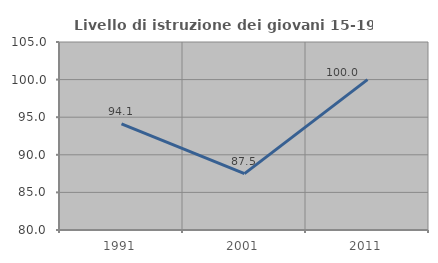
| Category | Livello di istruzione dei giovani 15-19 anni |
|---|---|
| 1991.0 | 94.118 |
| 2001.0 | 87.5 |
| 2011.0 | 100 |